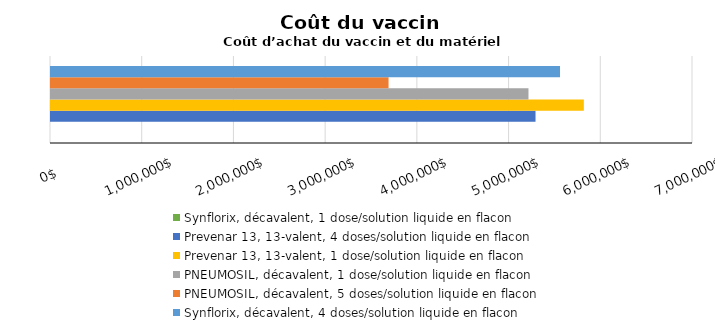
| Category | Synflorix, décavalent, 1 dose/solution liquide en flacon | Prevenar 13, 13-valent, 4 doses/solution liquide en flacon | Prevenar 13, 13-valent, 1 dose/solution liquide en flacon | PNEUMOSIL, décavalent, 1 dose/solution liquide en flacon | PNEUMOSIL, décavalent, 5 doses/solution liquide en flacon | Synflorix, décavalent, 4 doses/solution liquide en flacon |
|---|---|---|---|---|---|---|
| Total
pour 10 ans | 0 | 5283017.557 | 5809687.012 | 5206172.547 | 3680517.967 | 5550100.822 |